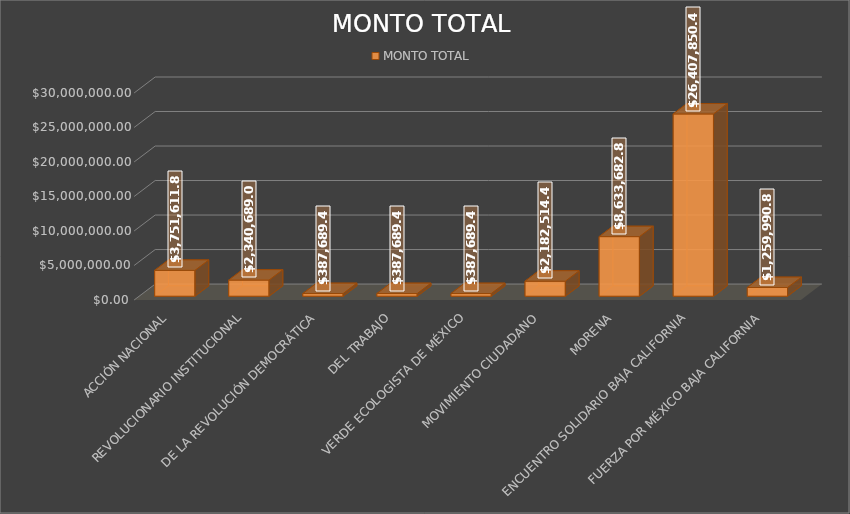
| Category | MONTO TOTAL |
|---|---|
| ACCIÓN NACIONAL | 3751611.86 |
| REVOLUCIONARIO INSTITUCIONAL | 2340689.08 |
| DE LA REVOLUCIÓN DEMOCRÁTICA | 387689.49 |
| DEL TRABAJO | 387689.49 |
| VERDE ECOLOGISTA DE MÉXICO | 387689.49 |
| MOVIMIENTO CIUDADANO | 2182514.41 |
| MORENA | 8633682.87 |
| ENCUENTRO SOLIDARIO BAJA CALIFORNIA | 26407850.41 |
| FUERZA POR MÉXICO BAJA CALIFORNIA | 1259990.85 |